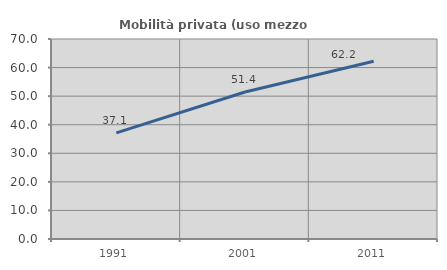
| Category | Mobilità privata (uso mezzo privato) |
|---|---|
| 1991.0 | 37.149 |
| 2001.0 | 51.447 |
| 2011.0 | 62.235 |